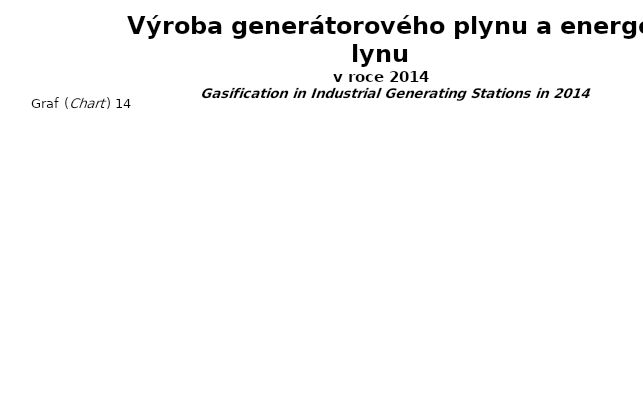
| Category | Series 0 |
|---|---|
| Prov. spotřeba (Work.Consump.) | 0 |
| Ztráty (Losses) | 0 |
| Generátorový plyn a energoplyn (Gas Works Gas) | 0 |